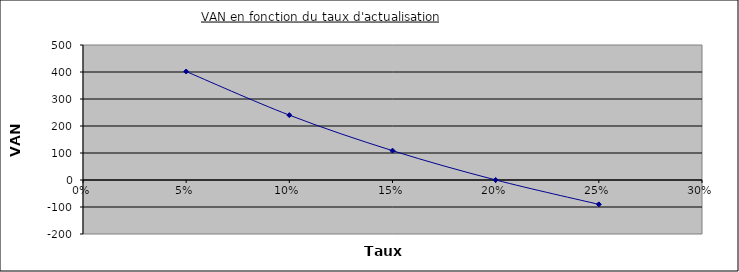
| Category | VAN |
|---|---|
| 0.05 | 401.843 |
| 0.1 | 240.236 |
| 0.15 | 108.647 |
| 0.2 | 0.184 |
| 0.25 | -90.216 |